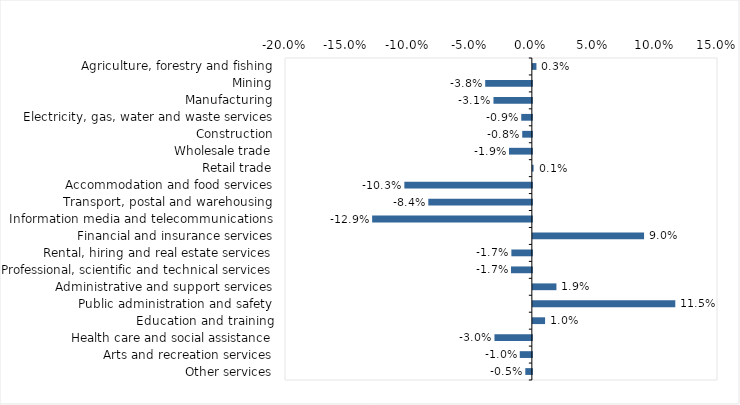
| Category | This week |
|---|---|
| Agriculture, forestry and fishing | 0.003 |
| Mining | -0.038 |
| Manufacturing | -0.031 |
| Electricity, gas, water and waste services | -0.009 |
| Construction | -0.008 |
| Wholesale trade | -0.018 |
| Retail trade | 0.001 |
| Accommodation and food services | -0.103 |
| Transport, postal and warehousing | -0.084 |
| Information media and telecommunications | -0.129 |
| Financial and insurance services | 0.09 |
| Rental, hiring and real estate services | -0.017 |
| Professional, scientific and technical services | -0.017 |
| Administrative and support services | 0.019 |
| Public administration and safety | 0.115 |
| Education and training | 0.01 |
| Health care and social assistance | -0.03 |
| Arts and recreation services | -0.01 |
| Other services | -0.005 |